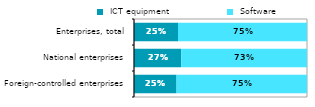
| Category |  ICT equipment |  Software |
|---|---|---|
|  Foreign-controlled enterprises | 0.246 | 0.754 |
|  National enterprises | 0.273 | 0.727 |
|  Enterprises, total | 0.254 | 0.746 |